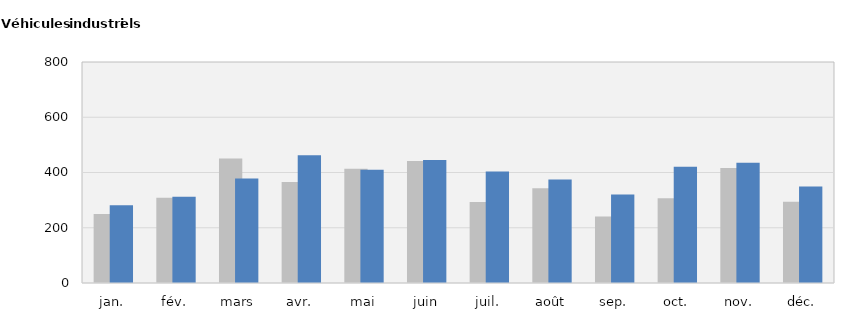
| Category | 2017 | 2018 |
|---|---|---|
| jan. | 250 | 281 |
| fév. | 309 | 312 |
| mars | 451 | 378 |
| avr. | 366 | 462 |
| mai | 414 | 410 |
| juin | 442 | 445 |
| juil. | 293 | 404 |
| août | 343 | 375 |
| sep. | 241 | 320 |
| oct. | 307 | 421 |
| nov. | 416 | 435 |
| déc. | 294 | 349 |